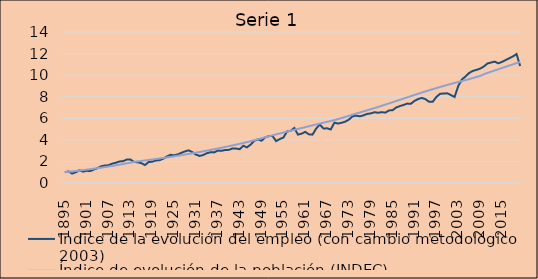
| Category | Índice de la evolución del empleo (con cambio metodológico en 2003) | Índice de evolución de la población (INDEC) |
|---|---|---|
| 1895 | 1 | 1 |
| 1896 | 1.075 | 1.036 |
| 1897 | 0.873 | 1.073 |
| 1898 | 0.995 | 1.112 |
| 1899 | 1.178 | 1.152 |
| 1900 | 1.051 | 1.193 |
| 1901 | 1.132 | 1.236 |
| 1902 | 1.103 | 1.281 |
| 1903 | 1.253 | 1.327 |
| 1904 | 1.378 | 1.375 |
| 1905 | 1.552 | 1.424 |
| 1906 | 1.62 | 1.475 |
| 1907 | 1.645 | 1.529 |
| 1908 | 1.795 | 1.584 |
| 1909 | 1.873 | 1.641 |
| 1910 | 1.998 | 1.7 |
| 1911 | 2.022 | 1.761 |
| 1912 | 2.174 | 1.824 |
| 1913 | 2.185 | 1.89 |
| 1914 | 1.947 | 1.958 |
| 1915 | 1.925 | 2 |
| 1916 | 1.84 | 2.043 |
| 1917 | 1.664 | 2.087 |
| 1918 | 1.938 | 2.132 |
| 1919 | 1.978 | 2.178 |
| 1920 | 2.09 | 2.225 |
| 1921 | 2.112 | 2.273 |
| 1922 | 2.247 | 2.322 |
| 1923 | 2.458 | 2.372 |
| 1924 | 2.612 | 2.423 |
| 1925 | 2.565 | 2.476 |
| 1926 | 2.651 | 2.529 |
| 1927 | 2.8 | 2.583 |
| 1928 | 2.933 | 2.639 |
| 1929 | 3.027 | 2.696 |
| 1930 | 2.864 | 2.754 |
| 1931 | 2.631 | 2.813 |
| 1932 | 2.511 | 2.874 |
| 1933 | 2.595 | 2.936 |
| 1934 | 2.765 | 2.999 |
| 1935 | 2.85 | 3.064 |
| 1936 | 2.839 | 3.13 |
| 1937 | 3.008 | 3.198 |
| 1938 | 2.981 | 3.267 |
| 1939 | 3.059 | 3.337 |
| 1940 | 3.072 | 3.409 |
| 1941 | 3.195 | 3.482 |
| 1942 | 3.194 | 3.557 |
| 1943 | 3.136 | 3.634 |
| 1944 | 3.451 | 3.712 |
| 1945 | 3.303 | 3.793 |
| 1946 | 3.559 | 3.874 |
| 1947 | 3.913 | 3.958 |
| 1948 | 4.046 | 4.052 |
| 1949 | 3.918 | 4.146 |
| 1950 | 4.227 | 4.24 |
| 1951 | 4.35 | 4.331 |
| 1952 | 4.365 | 4.42 |
| 1953 | 3.884 | 4.507 |
| 1954 | 4.073 | 4.594 |
| 1955 | 4.213 | 4.679 |
| 1956 | 4.782 | 4.764 |
| 1957 | 4.835 | 4.848 |
| 1958 | 5.101 | 4.931 |
| 1959 | 4.485 | 5.014 |
| 1960 | 4.575 | 5.097 |
| 1961 | 4.738 | 5.179 |
| 1962 | 4.51 | 5.262 |
| 1963 | 4.485 | 5.344 |
| 1964 | 5.048 | 5.426 |
| 1965 | 5.416 | 5.509 |
| 1966 | 5.057 | 5.59 |
| 1967 | 5.069 | 5.67 |
| 1968 | 4.964 | 5.751 |
| 1969 | 5.594 | 5.835 |
| 1970 | 5.512 | 5.924 |
| 1971 | 5.585 | 6.021 |
| 1972 | 5.692 | 6.124 |
| 1973 | 5.883 | 6.23 |
| 1974 | 6.184 | 6.336 |
| 1975 | 6.244 | 6.44 |
| 1976 | 6.179 | 6.541 |
| 1977 | 6.276 | 6.641 |
| 1978 | 6.406 | 6.741 |
| 1979 | 6.452 | 6.842 |
| 1980 | 6.563 | 6.945 |
| 1981 | 6.513 | 7.052 |
| 1982 | 6.567 | 7.16 |
| 1983 | 6.527 | 7.27 |
| 1984 | 6.729 | 7.381 |
| 1985 | 6.754 | 7.492 |
| 1986 | 7.009 | 7.604 |
| 1987 | 7.132 | 7.717 |
| 1988 | 7.237 | 7.83 |
| 1989 | 7.361 | 7.943 |
| 1990 | 7.343 | 8.055 |
| 1991 | 7.619 | 8.165 |
| 1992 | 7.785 | 8.276 |
| 1993 | 7.887 | 8.385 |
| 1994 | 7.774 | 8.493 |
| 1995 | 7.523 | 8.598 |
| 1996 | 7.536 | 8.701 |
| 1997 | 7.98 | 8.802 |
| 1998 | 8.264 | 8.901 |
| 1999 | 8.302 | 8.999 |
| 2000 | 8.313 | 9.094 |
| 2001 | 8.153 | 9.186 |
| 2002 | 7.975 | 9.275 |
| 2003 | 8.993 | 9.362 |
| 2004 | 9.599 | 9.45 |
| 2005 | 9.874 | 9.541 |
| 2006 | 10.202 | 9.634 |
| 2007 | 10.392 | 9.73 |
| 2008 | 10.487 | 9.826 |
| 2009 | 10.603 | 9.922 |
| 2010 | 10.797 | 10.084 |
| 2011 | 11.076 | 10.201 |
| 2012 | 11.17 | 10.317 |
| 2013 | 11.257 | 10.434 |
| 2014 | 11.095 | 10.549 |
| 2015 | 11.228 | 10.663 |
| 2016 | 11.402 | 10.777 |
| 2017 | 11.562 | 10.889 |
| 2018 | 11.736 | 11 |
| 2019 | 11.958 | 11.11 |
| 2020 | 10.842 | 11.218 |